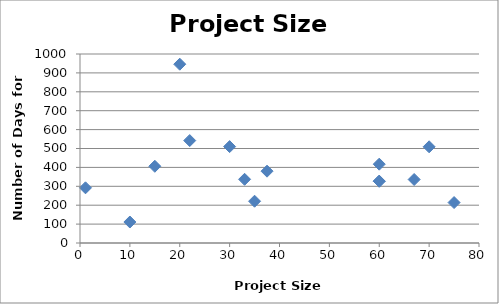
| Category | Project Size (MW) |
|---|---|
| nan | 343 |
| 37.5 | 380 |
| nan | 115 |
| nan | 98 |
| 15.0 | 406 |
| nan | 296 |
| 20.0 | 946 |
| 67.0 | 336 |
| 75.0 | 214 |
| 35.0 | 221 |
| 30.0 | 510 |
| nan | 217 |
| 1.1 | 292 |
| nan | 363 |
| nan | 155 |
| nan | 192 |
| nan | 853 |
| nan | 274 |
| 10.0 | 111 |
| nan | 77 |
| nan | 560 |
| 33.0 | 337 |
| 22.0 | 542 |
| nan | 125 |
| nan | 354 |
| 70.0 | 509 |
| nan | 302 |
| nan | 532 |
| 60.0 | 327 |
| 60.0 | 417 |
| 60.0 | 327 |
| nan | 215 |
| nan | 142 |
| nan | 158 |
| nan | 725 |
| nan | 739 |
| nan | 292 |
| nan | 112 |
| nan | 407 |